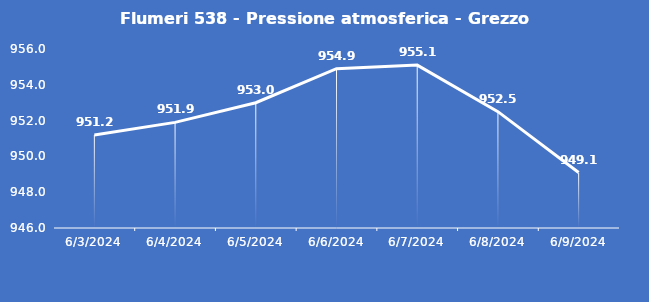
| Category | Flumeri 538 - Pressione atmosferica - Grezzo (hPa) |
|---|---|
| 6/3/24 | 951.2 |
| 6/4/24 | 951.9 |
| 6/5/24 | 953 |
| 6/6/24 | 954.9 |
| 6/7/24 | 955.1 |
| 6/8/24 | 952.5 |
| 6/9/24 | 949.1 |